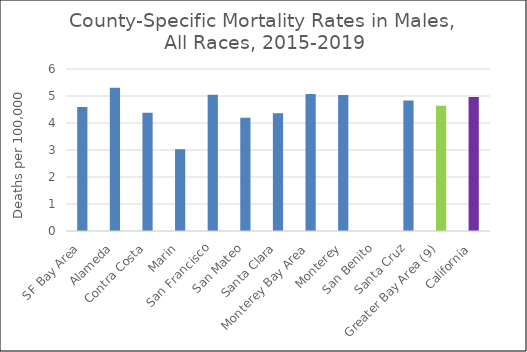
| Category | Male |
|---|---|
| SF Bay Area | 4.59 |
|   Alameda | 5.31 |
|   Contra Costa | 4.38 |
|   Marin | 3.03 |
|   San Francisco | 5.05 |
|   San Mateo | 4.19 |
|   Santa Clara | 4.36 |
| Monterey Bay Area | 5.07 |
|   Monterey | 5.04 |
|   San Benito | 0 |
|   Santa Cruz | 4.83 |
| Greater Bay Area (9) | 4.64 |
| California | 4.96 |